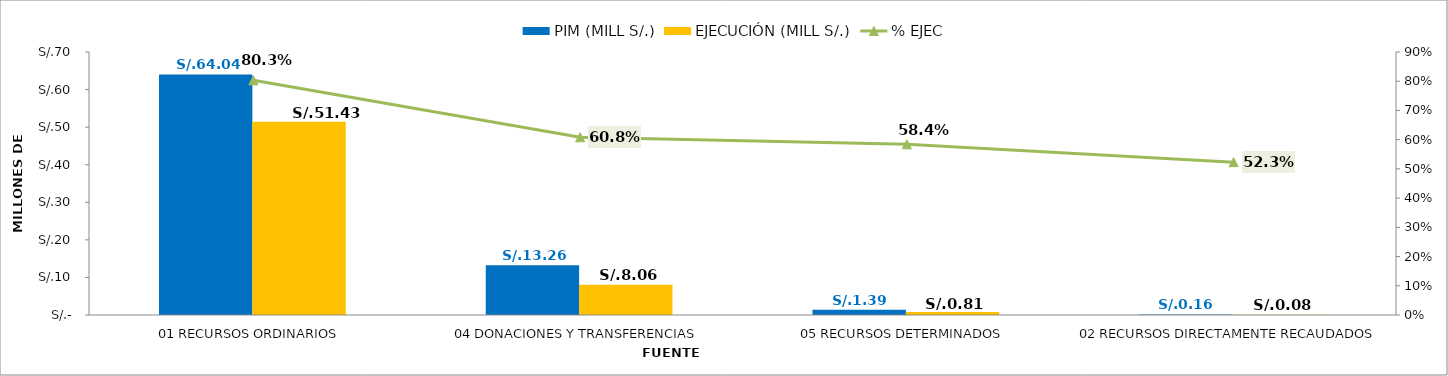
| Category | PIM (MILL S/.) | EJECUCIÓN (MILL S/.) |
|---|---|---|
| 01 RECURSOS ORDINARIOS | 64.044 | 51.427 |
| 04 DONACIONES Y TRANSFERENCIAS | 13.259 | 8.064 |
| 05 RECURSOS DETERMINADOS | 1.394 | 0.814 |
| 02 RECURSOS DIRECTAMENTE RECAUDADOS | 0.157 | 0.082 |